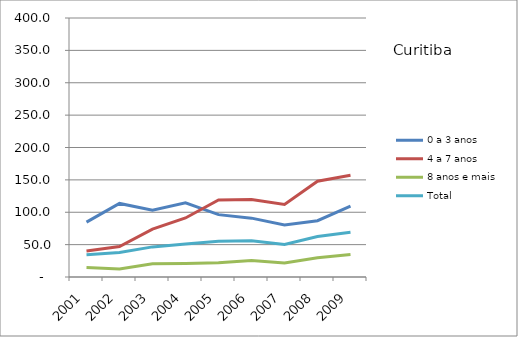
| Category | 0 a 3 anos | 4 a 7 anos | 8 anos e mais | Total |
|---|---|---|---|---|
| 2001.0 | 84.7 | 40.2 | 14.6 | 34.4 |
| 2002.0 | 113.6 | 47.1 | 12.5 | 37.7 |
| 2003.0 | 103 | 73.9 | 20.4 | 46.5 |
| 2004.0 | 114.7 | 91.2 | 20.9 | 51 |
| 2005.0 | 96.3 | 119.1 | 21.9 | 55.1 |
| 2006.0 | 90.9 | 119.5 | 25.4 | 56.1 |
| 2007.0 | 80.2 | 111.9 | 21.5 | 50.4 |
| 2008.0 | 87 | 147.9 | 29.8 | 62.4 |
| 2009.0 | 109.4 | 157.2 | 34.6 | 69 |